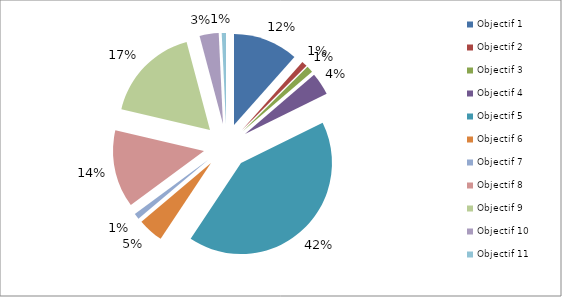
| Category | Series 0 |
|---|---|
| Objectif 1  | 9204025 |
| Objectif 2 | 789330 |
| Objectif 3 | 931375.4 |
| Objectif 4 | 3186525 |
| Objectif 5 | 33143170 |
| Objectif 6 | 3601931 |
| Objectif 7 | 810000 |
| Objectif 8 | 10970077 |
| Objectif 9 | 13708081 |
| Objectif 10 | 2700000 |
| Objectif 11 | 600000 |